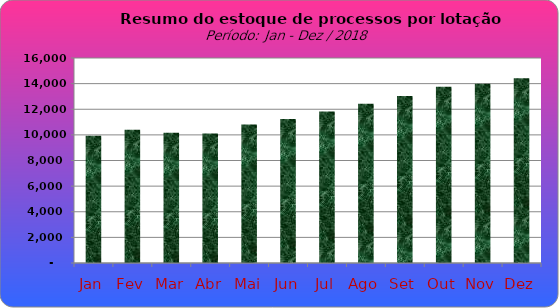
| Category | Series 0 |
|---|---|
| Jan | 9933 |
| Fev | 10393 |
| Mar | 10166 |
| Abr | 10112 |
| Mai | 10819 |
| Jun | 11230 |
| Jul | 11829 |
| Ago | 12430 |
| Set | 13030 |
| Out | 13758 |
| Nov | 13989 |
| Dez | 14411 |